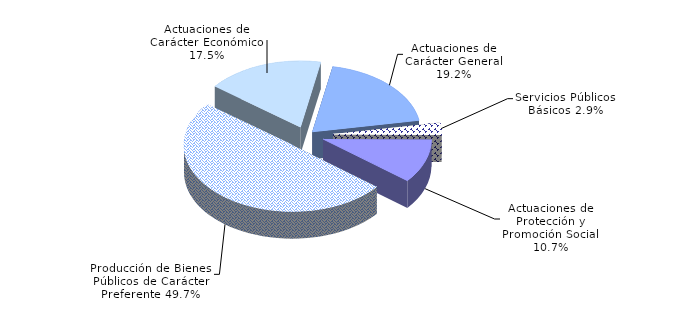
| Category | Series 0 |
|---|---|
| Servicios Públicos Básicos | 2.884 |
| Actuaciones de Protección y Promoción Social | 10.705 |
| Producción de Bienes Públicos de Carácter Preferente | 49.73 |
| Actuaciones de Carácter Económico | 17.462 |
| Actuaciones de Carácter General | 19.22 |